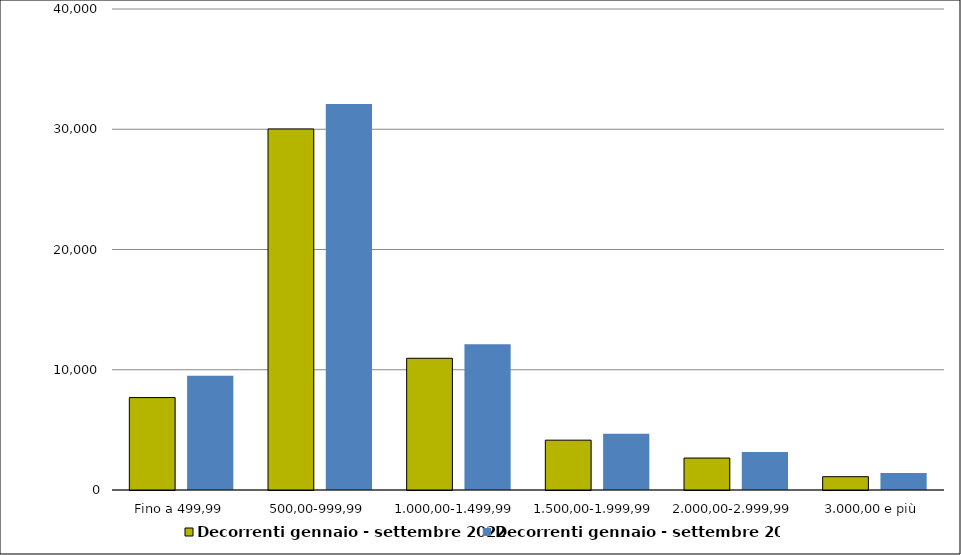
| Category | Decorrenti gennaio - settembre 2022 | Decorrenti gennaio - settembre 2021 |
|---|---|---|
| Fino a 499,99 | 7687 | 9506 |
| 500,00-999,99 | 30024 | 32090 |
| 1.000,00-1.499,99 | 10954 | 12120 |
| 1.500,00-1.999,99 | 4144 | 4684 |
| 2.000,00-2.999,99 | 2657 | 3154 |
| 3.000,00 e più | 1106 | 1416 |